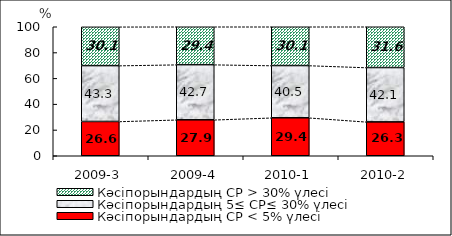
| Category | Кәсіпорындардың СР < 5% үлесі | Кәсіпорындардың 5≤ СР≤ 30% үлесі | Кәсіпорындардың СР > 30% үлесі |
|---|---|---|---|
| 2009-3 | 26.58 | 43.3 | 30.07 |
| 2009-4 | 27.88 | 42.73 | 29.39 |
| 2010-1 | 29.44 | 40.49 | 30.07 |
| 2010-2 | 26.26 | 42.12 | 31.62 |